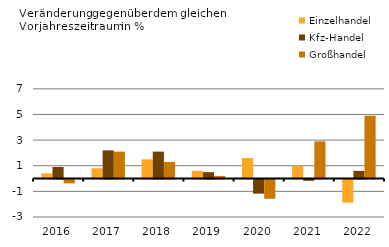
| Category | Einzelhandel | Kfz-Handel | Großhandel |
|---|---|---|---|
| 2016.0 | 0.4 | 0.9 | -0.3 |
| 2017.0 | 0.8 | 2.2 | 2.1 |
| 2018.0 | 1.5 | 2.1 | 1.3 |
| 2019.0 | 0.6 | 0.5 | 0.2 |
| 2020.0 | 1.6 | -1.1 | -1.5 |
| 2021.0 | 1 | -0.1 | 2.9 |
| 2022.0 | -1.8 | 0.6 | 4.9 |